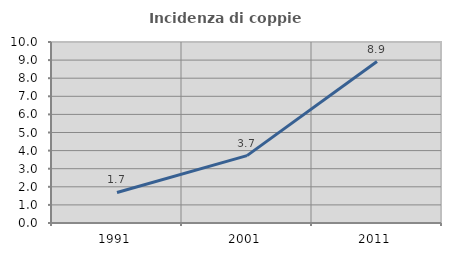
| Category | Incidenza di coppie miste |
|---|---|
| 1991.0 | 1.685 |
| 2001.0 | 3.723 |
| 2011.0 | 8.92 |